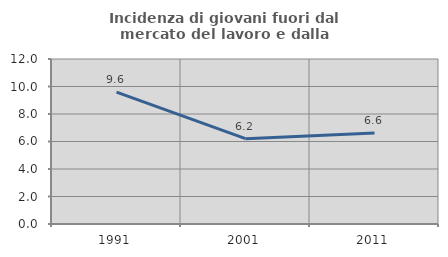
| Category | Incidenza di giovani fuori dal mercato del lavoro e dalla formazione  |
|---|---|
| 1991.0 | 9.589 |
| 2001.0 | 6.208 |
| 2011.0 | 6.623 |